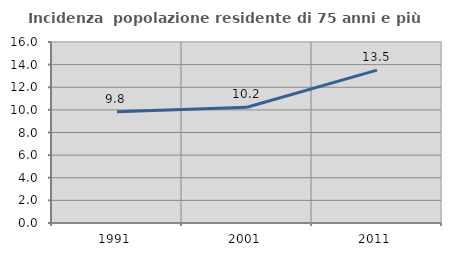
| Category | Incidenza  popolazione residente di 75 anni e più |
|---|---|
| 1991.0 | 9.83 |
| 2001.0 | 10.233 |
| 2011.0 | 13.514 |